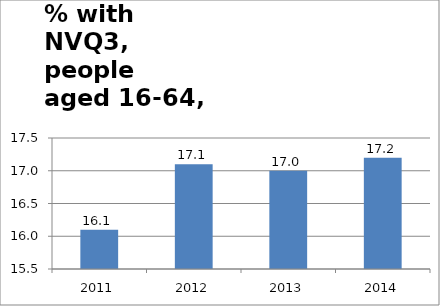
| Category | % with NVQ3 only - aged 16-64 |
|---|---|
| 2011.0 | 16.1 |
| 2012.0 | 17.1 |
| 2013.0 | 17 |
| 2014.0 | 17.2 |